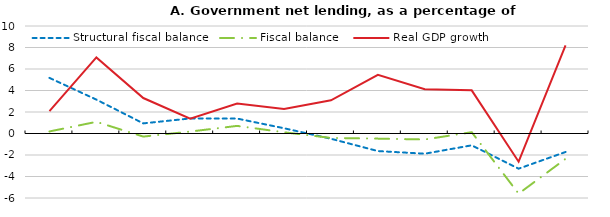
| Category | Structural fiscal balance | Fiscal balance | Real GDP growth |
|---|---|---|---|
|  | 5.172 | 0.191 | 2.075 |
|  | 3.153 | 1.085 | 7.082 |
|  | 0.941 | -0.287 | 3.3 |
|  | 1.4 | 0.181 | 1.371 |
|  | 1.388 | 0.708 | 2.791 |
|  | 0.489 | 0.114 | 2.289 |
|  | -0.488 | -0.413 | 3.088 |
|  | -1.635 | -0.476 | 5.451 |
|  | -1.879 | -0.556 | 4.123 |
|  | -1.1 | 0.122 | 4.016 |
|  | -3.272 | -5.599 | -2.625 |
|  | -1.72 | -2.358 | 8.193 |